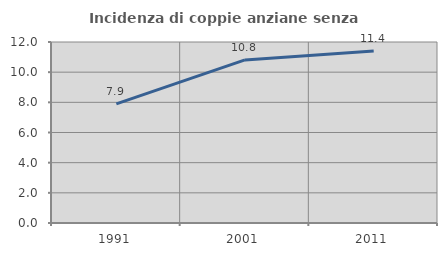
| Category | Incidenza di coppie anziane senza figli  |
|---|---|
| 1991.0 | 7.903 |
| 2001.0 | 10.811 |
| 2011.0 | 11.404 |